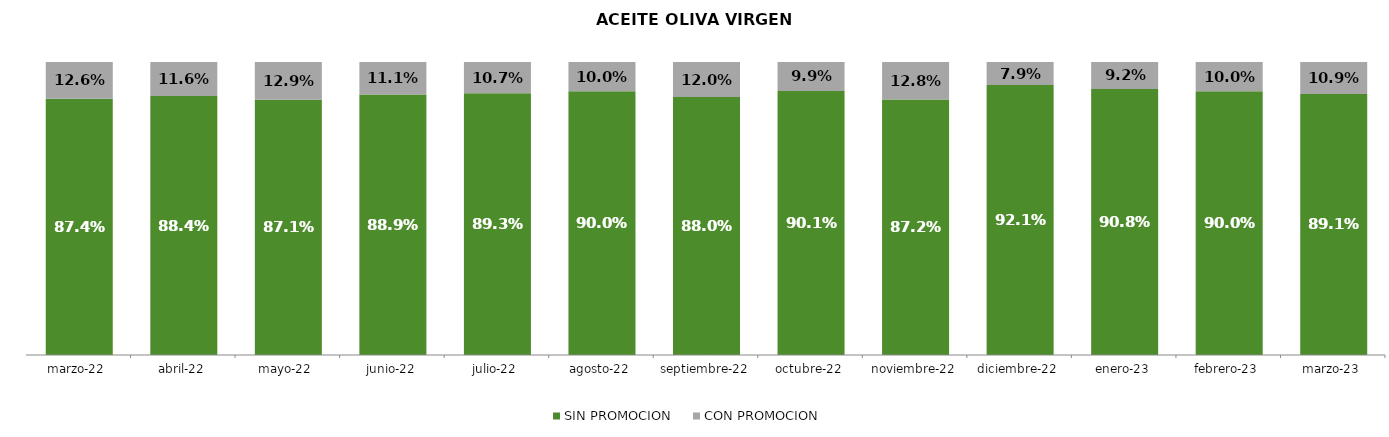
| Category | SIN PROMOCION   | CON PROMOCION   |
|---|---|---|
| 2022-03-01 | 0.874 | 0.126 |
| 2022-04-01 | 0.884 | 0.116 |
| 2022-05-01 | 0.871 | 0.129 |
| 2022-06-01 | 0.889 | 0.111 |
| 2022-07-01 | 0.893 | 0.107 |
| 2022-08-01 | 0.9 | 0.1 |
| 2022-09-01 | 0.88 | 0.12 |
| 2022-10-01 | 0.901 | 0.099 |
| 2022-11-01 | 0.872 | 0.128 |
| 2022-12-01 | 0.921 | 0.079 |
| 2023-01-01 | 0.908 | 0.092 |
| 2023-02-01 | 0.9 | 0.1 |
| 2023-03-01 | 0.891 | 0.109 |